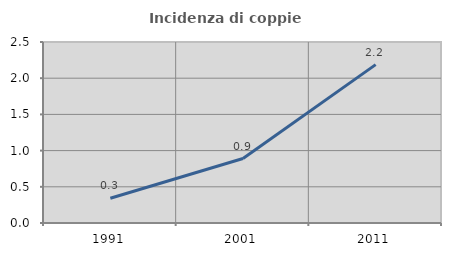
| Category | Incidenza di coppie miste |
|---|---|
| 1991.0 | 0.341 |
| 2001.0 | 0.891 |
| 2011.0 | 2.188 |